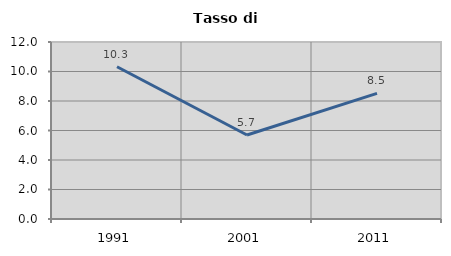
| Category | Tasso di disoccupazione   |
|---|---|
| 1991.0 | 10.324 |
| 2001.0 | 5.693 |
| 2011.0 | 8.516 |